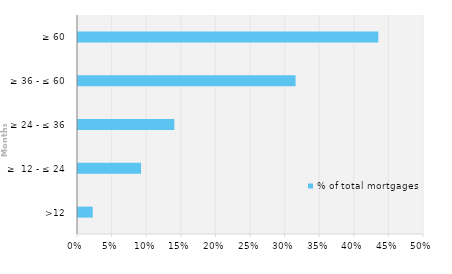
| Category | % of total mortgages |
|---|---|
| >12 | 0.021 |
| ≥  12 - ≤ 24 | 0.091 |
| ≥ 24 - ≤ 36 | 0.139 |
| ≥ 36 - ≤ 60 | 0.314 |
| ≥ 60 | 0.434 |